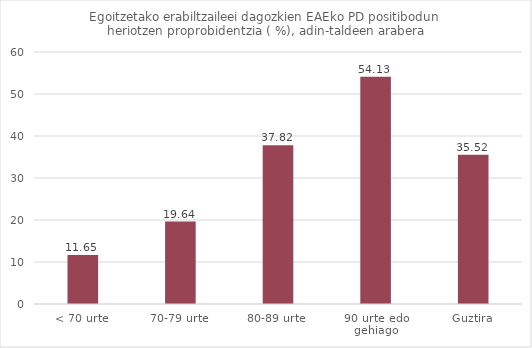
| Category | Series 0 |
|---|---|
| < 70 urte | 11.649 |
| 70-79 urte | 19.643 |
| 80-89 urte | 37.817 |
| 90 urte edo gehiago | 54.128 |
| Guztira | 35.518 |